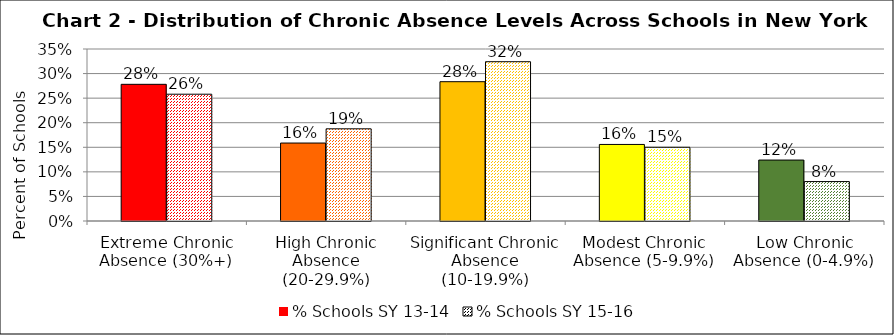
| Category | % Schools SY 13-14 | % Schools SY 15-16 |
|---|---|---|
| Extreme Chronic Absence (30%+) | 0.278 | 0.258 |
| High Chronic Absence (20-29.9%) | 0.159 | 0.188 |
| Significant Chronic Absence (10-19.9%) | 0.283 | 0.324 |
| Modest Chronic Absence (5-9.9%) | 0.156 | 0.15 |
| Low Chronic Absence (0-4.9%) | 0.124 | 0.08 |